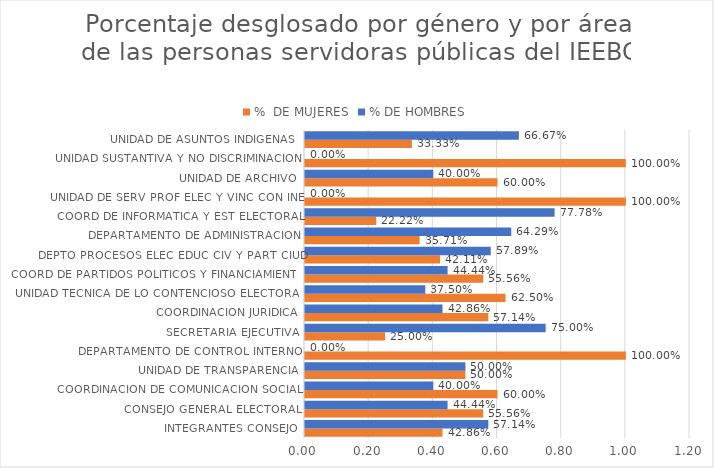
| Category | %  DE MUJERES | % DE HOMBRES |
|---|---|---|
| INTEGRANTES CONSEJO | 0.429 | 0.571 |
| CONSEJO GENERAL ELECTORAL | 0.556 | 0.444 |
| COORDINACION DE COMUNICACION SOCIAL | 0.6 | 0.4 |
| UNIDAD DE TRANSPARENCIA | 0.5 | 0.5 |
| DEPARTAMENTO DE CONTROL INTERNO | 1 | 0 |
| SECRETARIA EJECUTIVA | 0.25 | 0.75 |
| COORDINACION JURIDICA | 0.571 | 0.429 |
| UNIDAD TECNICA DE LO CONTENCIOSO ELECTORAL | 0.625 | 0.375 |
| COORD DE PARTIDOS POLITICOS Y FINANCIAMIENTO | 0.556 | 0.444 |
| DEPTO PROCESOS ELEC EDUC CIV Y PART CIUD | 0.421 | 0.579 |
| DEPARTAMENTO DE ADMINISTRACION | 0.357 | 0.643 |
| COORD DE INFORMATICA Y EST ELECTORAL | 0.222 | 0.778 |
| UNIDAD DE SERV PROF ELEC Y VINC CON INE | 1 | 0 |
| UNIDAD DE ARCHIVO | 0.6 | 0.4 |
| UNIDAD SUSTANTIVA Y NO DISCRIMINACION | 1 | 0 |
| UNIDAD DE ASUNTOS INDIGENAS  | 0.333 | 0.667 |